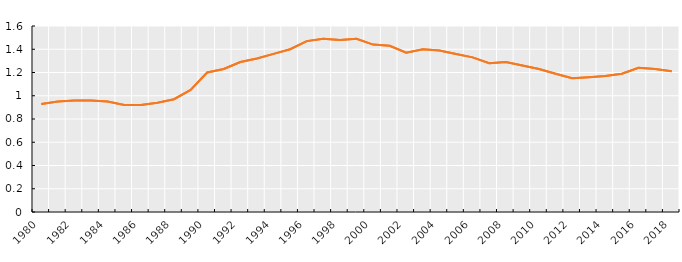
| Category | Coefficient of variation |
|---|---|
| 1980.0 | 0.93 |
| 1981.0 | 0.95 |
| 1982.0 | 0.96 |
| 1983.0 | 0.96 |
| 1984.0 | 0.95 |
| 1985.0 | 0.92 |
| 1986.0 | 0.92 |
| 1987.0 | 0.94 |
| 1988.0 | 0.97 |
| 1989.0 | 1.05 |
| 1990.0 | 1.2 |
| 1991.0 | 1.23 |
| 1992.0 | 1.29 |
| 1993.0 | 1.32 |
| 1994.0 | 1.36 |
| 1995.0 | 1.4 |
| 1996.0 | 1.47 |
| 1997.0 | 1.49 |
| 1998.0 | 1.48 |
| 1999.0 | 1.49 |
| 2000.0 | 1.44 |
| 2001.0 | 1.43 |
| 2002.0 | 1.37 |
| 2003.0 | 1.4 |
| 2004.0 | 1.39 |
| 2005.0 | 1.36 |
| 2006.0 | 1.33 |
| 2007.0 | 1.28 |
| 2008.0 | 1.29 |
| 2009.0 | 1.26 |
| 2010.0 | 1.23 |
| 2011.0 | 1.19 |
| 2012.0 | 1.15 |
| 2013.0 | 1.16 |
| 2014.0 | 1.17 |
| 2015.0 | 1.19 |
| 2016.0 | 1.24 |
| 2017.0 | 1.23 |
| 2018.0 | 1.21 |